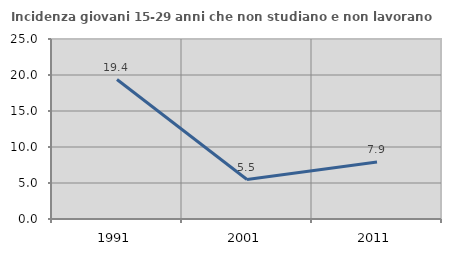
| Category | Incidenza giovani 15-29 anni che non studiano e non lavorano  |
|---|---|
| 1991.0 | 19.368 |
| 2001.0 | 5.479 |
| 2011.0 | 7.925 |